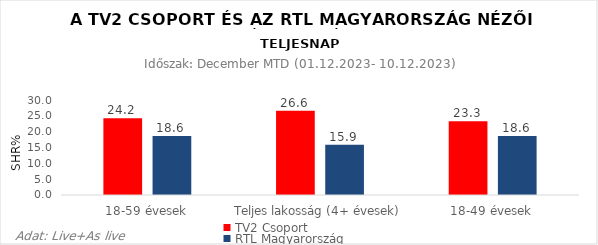
| Category | TV2 Csoport | RTL Magyarország |
|---|---|---|
| 18-59 évesek | 24.2 | 18.6 |
| Teljes lakosság (4+ évesek) | 26.6 | 15.9 |
| 18-49 évesek | 23.3 | 18.6 |